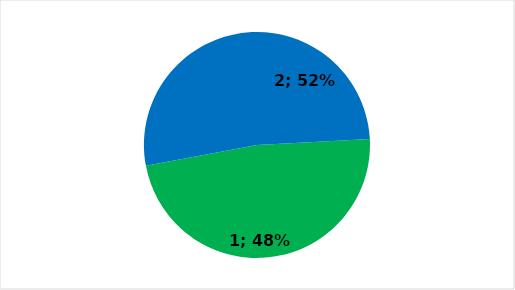
| Category | Series 0 |
|---|---|
| 0 | 239 |
| 1 | 260 |